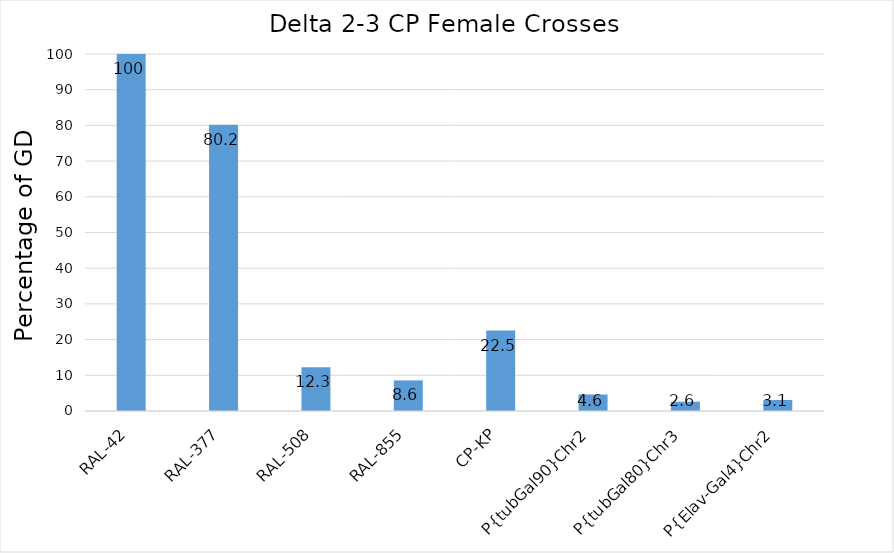
| Category | GD percentage |
|---|---|
| RAL-42 | 100 |
| RAL-377 | 80.189 |
| RAL-508 | 12.264 |
| RAL-855 | 8.571 |
| CP-KP | 22.541 |
| P{tubGal90}Chr2 | 4.63 |
| P{tubGal80}Chr3 | 2.597 |
| P{Elav-Gal4}Chr2 | 3.093 |